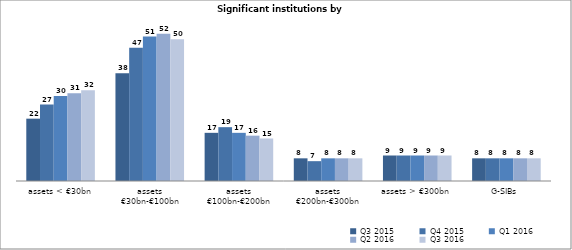
| Category | Q3 2015 | Q4 2015 | Q1 2016 | Q2 2016 | Q3 2016 |
|---|---|---|---|---|---|
| assets < €30bn | 22 | 27 | 30 | 31 | 32 |
| assets
€30bn-€100bn | 38 | 47 | 51 | 52 | 50 |
| assets
€100bn-€200bn | 17 | 19 | 17 | 16 | 15 |
| assets
€200bn-€300bn | 8 | 7 | 8 | 8 | 8 |
| assets > €300bn | 9 | 9 | 9 | 9 | 9 |
| G-SIBs | 8 | 8 | 8 | 8 | 8 |